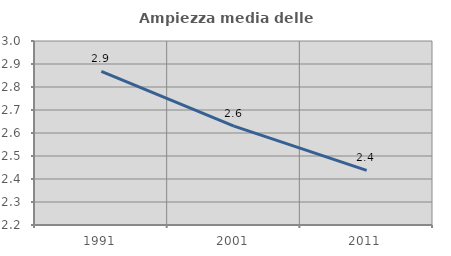
| Category | Ampiezza media delle famiglie |
|---|---|
| 1991.0 | 2.868 |
| 2001.0 | 2.63 |
| 2011.0 | 2.437 |